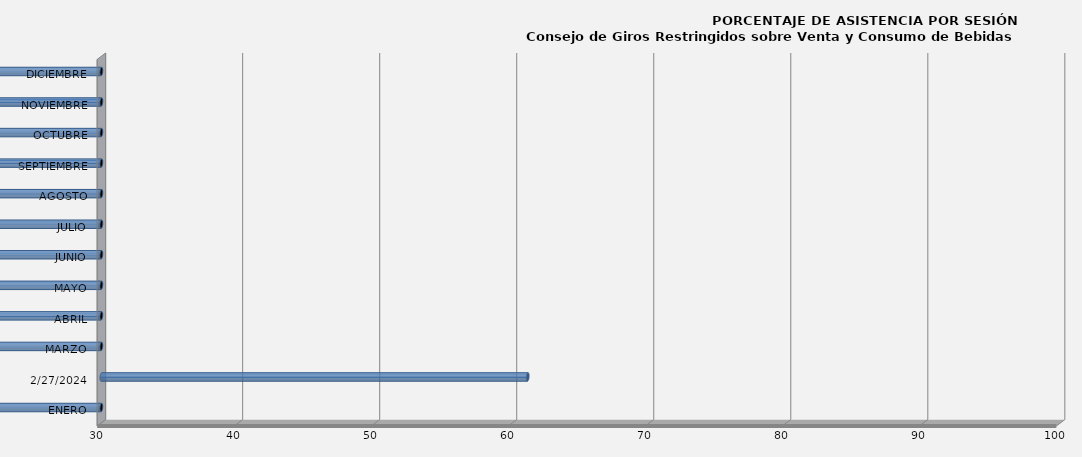
| Category | Series 0 |
|---|---|
| ENERO | 0 |
| 27/02/2024 | 61.111 |
| MARZO | 0 |
| ABRIL | 0 |
| MAYO | 0 |
| JUNIO | 0 |
| JULIO | 0 |
| AGOSTO | 0 |
| SEPTIEMBRE | 0 |
| OCTUBRE | 0 |
| NOVIEMBRE | 0 |
| DICIEMBRE | 0 |